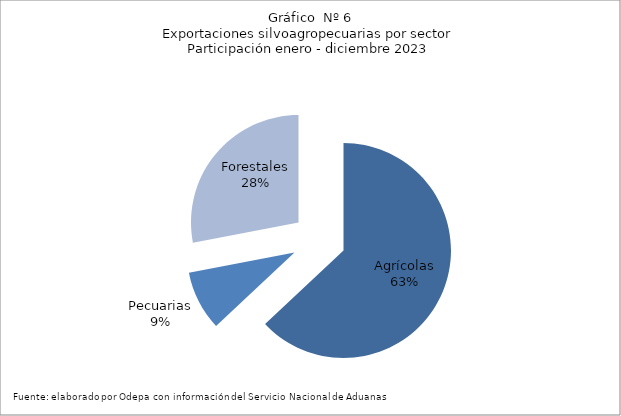
| Category | Series 0 |
|---|---|
| Agrícolas | 11022613 |
| Pecuarias | 1571492 |
| Forestales | 4898677 |